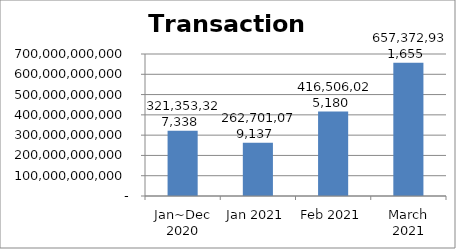
| Category | Transaction Amount(USD) |
|---|---|
| Jan~Dec 2020 | 321353327338.13 |
| Jan 2021 | 262701079136.691 |
| Feb 2021 | 416506025179.856 |
| March 2021 | 657372931654.676 |